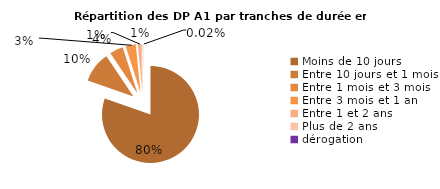
| Category | Series 0 |
|---|---|
| Moins de 10 jours | 47241 |
| Entre 10 jours et 1 mois | 5998 |
| Entre 1 mois et 3 mois | 2644 |
| Entre 3 mois et 1 an | 1985 |
| Entre 1 et 2 ans | 584 |
| Plus de 2 ans | 325 |
| dérogation | 10 |